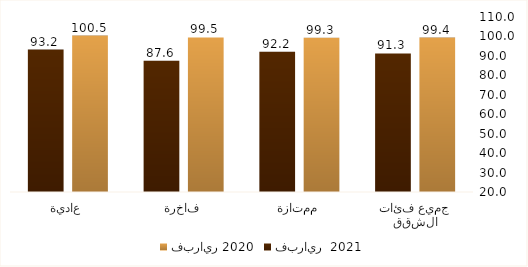
| Category | فبراير 2020 | فبراير  2021 |
|---|---|---|
| جميع فئات الشقق | 99.428 | 91.261 |
| ممتازة | 99.31 | 92.187 |
| فاخرة | 99.483 | 87.554 |
| عادية | 100.451 | 93.24 |